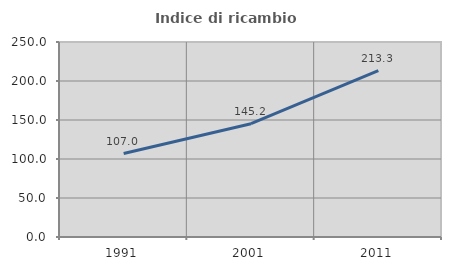
| Category | Indice di ricambio occupazionale  |
|---|---|
| 1991.0 | 106.977 |
| 2001.0 | 145.238 |
| 2011.0 | 213.333 |